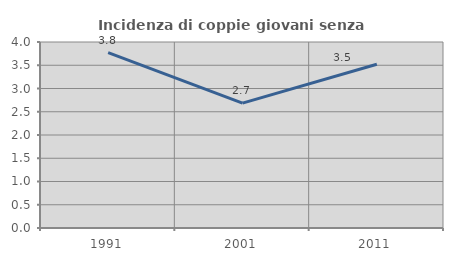
| Category | Incidenza di coppie giovani senza figli |
|---|---|
| 1991.0 | 3.771 |
| 2001.0 | 2.685 |
| 2011.0 | 3.522 |